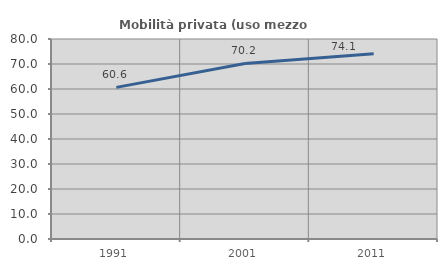
| Category | Mobilità privata (uso mezzo privato) |
|---|---|
| 1991.0 | 60.649 |
| 2001.0 | 70.211 |
| 2011.0 | 74.095 |